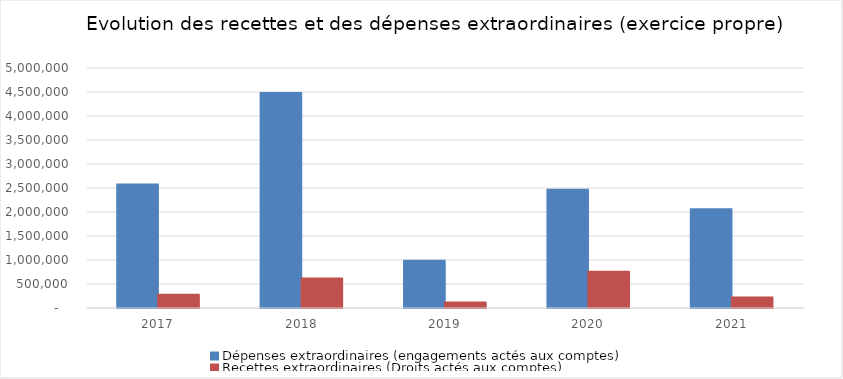
| Category | Dépenses extraordinaires (engagements actés aux comptes) | Recettes extraordinaires (Droits actés aux comptes) |
|---|---|---|
| 2017.0 | 2560046.27 | 267875 |
| 2018.0 | 4466906.46 | 606188.92 |
| 2019.0 | 973653.08 | 102340 |
| 2020.0 | 2452482.47 | 742701.92 |
| 2021.0 | 2047674.85 | 206027.36 |